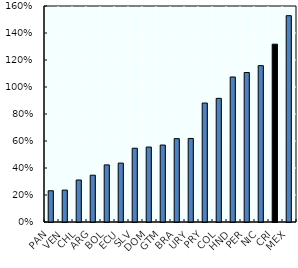
| Category | Theoretical formalisation costs for workers in the first income decile |
|---|---|
| PAN | 0.232 |
| VEN | 0.236 |
| CHL | 0.311 |
| ARG | 0.347 |
| BOL | 0.423 |
| ECU | 0.436 |
| SLV | 0.546 |
| DOM | 0.555 |
| GTM | 0.57 |
| BRA | 0.617 |
| URY | 0.619 |
| PRY | 0.881 |
| COL | 0.916 |
| HND | 1.074 |
| PER | 1.107 |
| NIC | 1.158 |
| CRI | 1.317 |
| MEX | 1.528 |